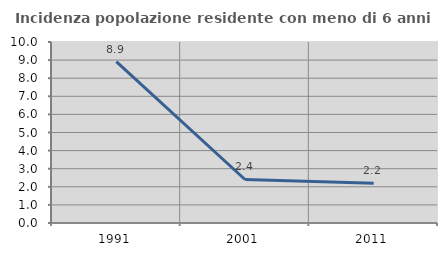
| Category | Incidenza popolazione residente con meno di 6 anni |
|---|---|
| 1991.0 | 8.92 |
| 2001.0 | 2.404 |
| 2011.0 | 2.198 |